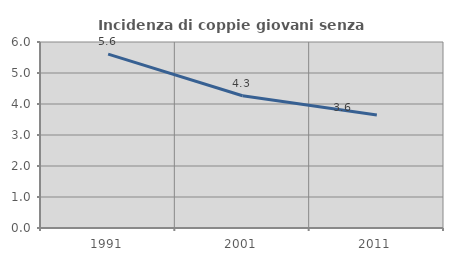
| Category | Incidenza di coppie giovani senza figli |
|---|---|
| 1991.0 | 5.607 |
| 2001.0 | 4.265 |
| 2011.0 | 3.646 |